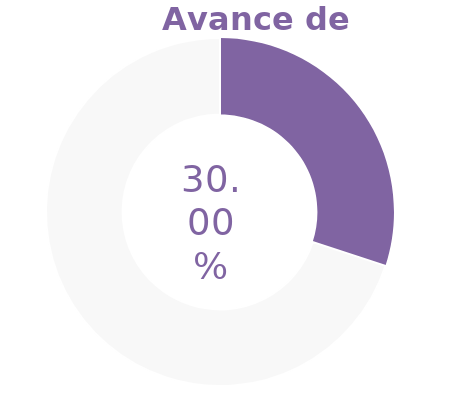
| Category | Series 0 |
|---|---|
| Acumulado 1 Trimestre | 0.3 |
| Año | -0.7 |